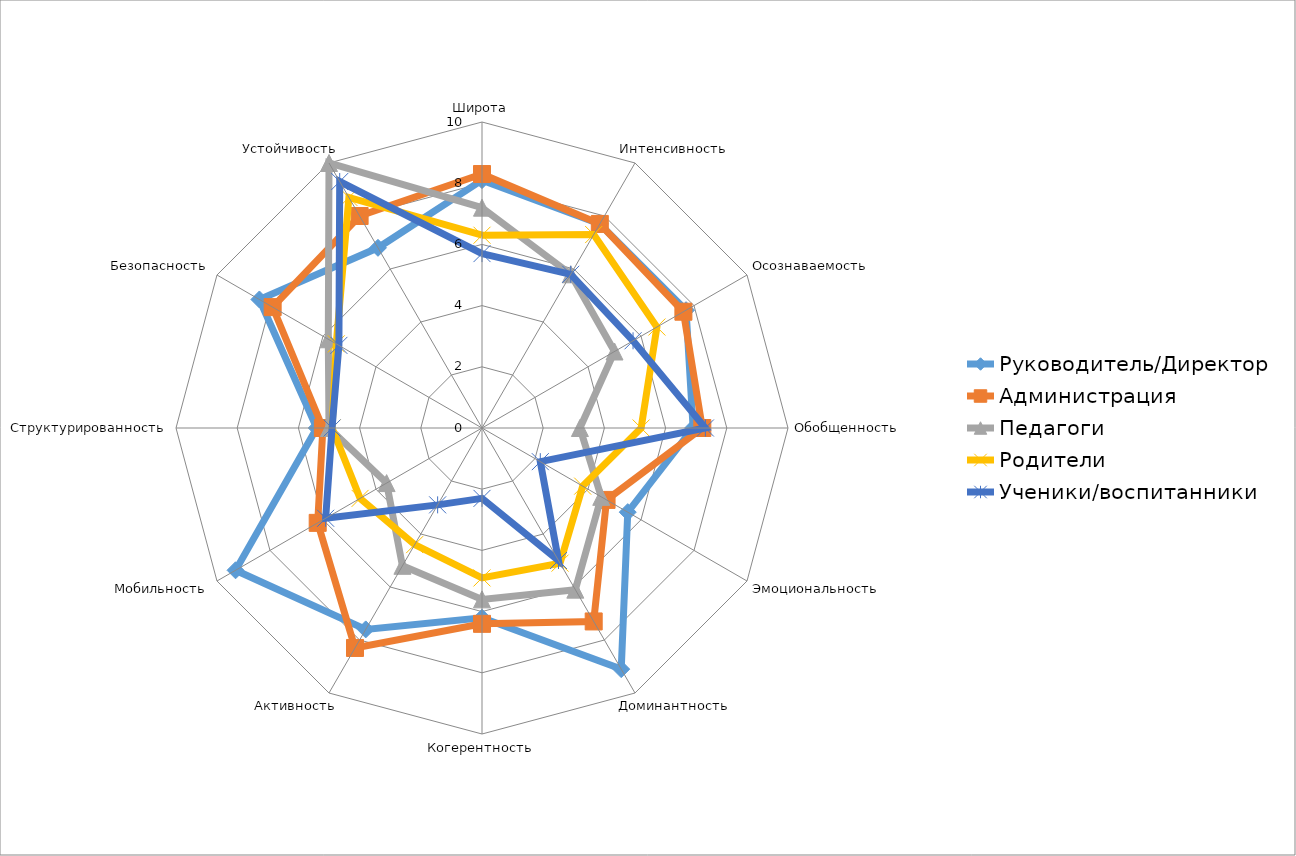
| Category | Руководитель/Директор | Администрация | Педагоги | Родители | Ученики/воспитанники |
|---|---|---|---|---|---|
| Широта | 8.1 | 8.3 | 7.2 | 6.3 | 5.7 |
| Интенсивность | 7.7 | 7.7 | 5.8 | 7.3 | 5.8 |
| Осознаваемость | 7.7 | 7.6 | 5 | 6.6 | 5.7 |
| Обобщенность | 6.9 | 7.2 | 3.2 | 5.2 | 7.3 |
| Эмоциональность | 5.5 | 4.7 | 4.5 | 3.8 | 2.2 |
| Доминантность | 9.1 | 7.3 | 6.1 | 5.1 | 5 |
| Когерентность | 6.2 | 6.4 | 5.6 | 4.9 | 2.3 |
| Активность | 7.6 | 8.3 | 5.2 | 4.4 | 2.9 |
| Мобильность | 9.3 | 6.2 | 3.6 | 4.6 | 5.9 |
| Структурированность | 5.4 | 5.2 | 5 | 4.9 | 4.9 |
| Безопасность | 8.4 | 7.9 | 5.8 | 5.5 | 5.4 |
| Устойчивость | 6.8 | 8 | 10 | 8.7 | 9.3 |